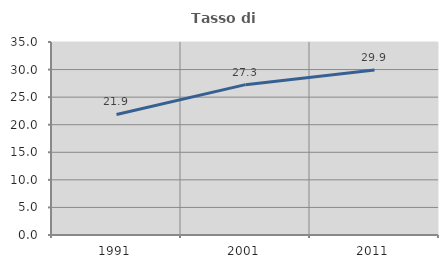
| Category | Tasso di occupazione   |
|---|---|
| 1991.0 | 21.865 |
| 2001.0 | 27.266 |
| 2011.0 | 29.933 |